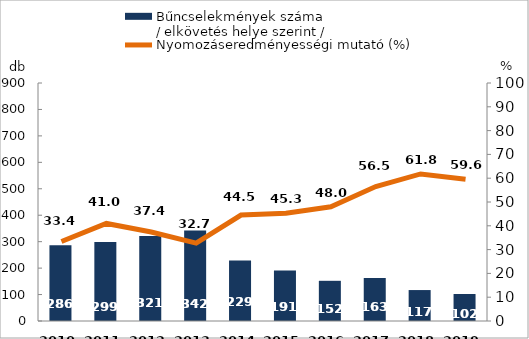
| Category | Bűncselekmények száma
/ elkövetés helye szerint / |
|---|---|
| 2010. év | 286 |
| 2011. év | 299 |
| 2012. év | 321 |
| 2013. év | 342 |
| 2014. év | 229 |
| 2015. év | 191 |
| 2016. év | 152 |
| 2017. év | 163 |
| 2018. év | 117 |
| 2019. év | 102 |